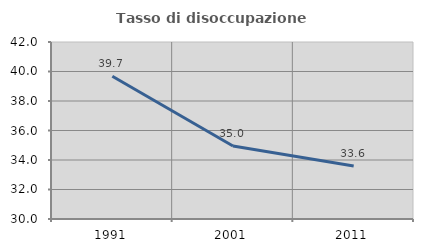
| Category | Tasso di disoccupazione giovanile  |
|---|---|
| 1991.0 | 39.677 |
| 2001.0 | 34.951 |
| 2011.0 | 33.6 |